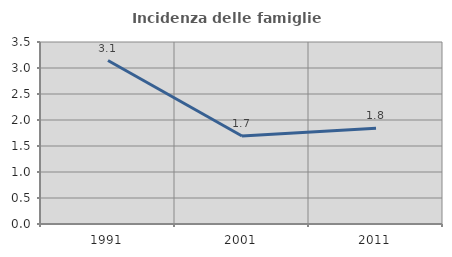
| Category | Incidenza delle famiglie numerose |
|---|---|
| 1991.0 | 3.144 |
| 2001.0 | 1.691 |
| 2011.0 | 1.84 |